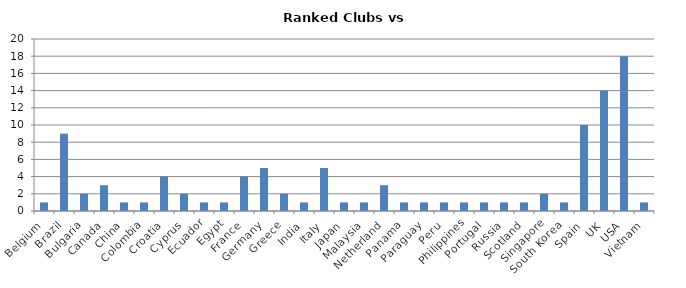
| Category | Series 0 |
|---|---|
| Belgium | 1 |
| Brazil | 9 |
| Bulgaria | 2 |
| Canada | 3 |
| China | 1 |
| Colombia | 1 |
| Croatia | 4 |
| Cyprus | 2 |
| Ecuador | 1 |
| Egypt | 1 |
| France | 4 |
| Germany | 5 |
| Greece | 2 |
| India | 1 |
| Italy | 5 |
| Japan | 1 |
| Malaysia | 1 |
| Netherland | 3 |
| Panama | 1 |
| Paraguay | 1 |
| Peru | 1 |
| Philippines | 1 |
| Portugal | 1 |
| Russia | 1 |
| Scotland | 1 |
| Singapore | 2 |
| South Korea | 1 |
| Spain | 10 |
| UK | 14 |
| USA | 18 |
| Vietnam | 1 |